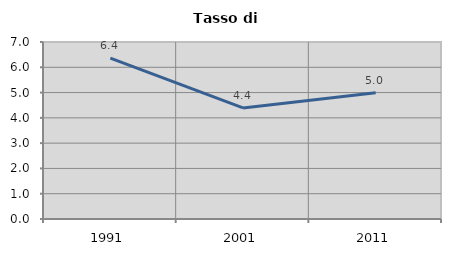
| Category | Tasso di disoccupazione   |
|---|---|
| 1991.0 | 6.361 |
| 2001.0 | 4.393 |
| 2011.0 | 4.995 |